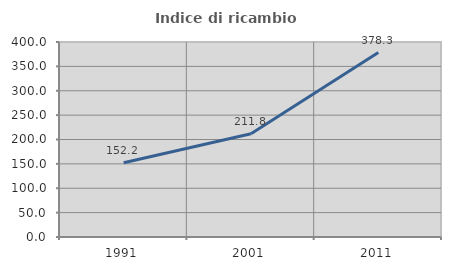
| Category | Indice di ricambio occupazionale  |
|---|---|
| 1991.0 | 152.174 |
| 2001.0 | 211.765 |
| 2011.0 | 378.261 |